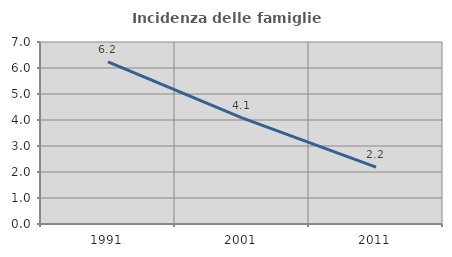
| Category | Incidenza delle famiglie numerose |
|---|---|
| 1991.0 | 6.239 |
| 2001.0 | 4.085 |
| 2011.0 | 2.189 |